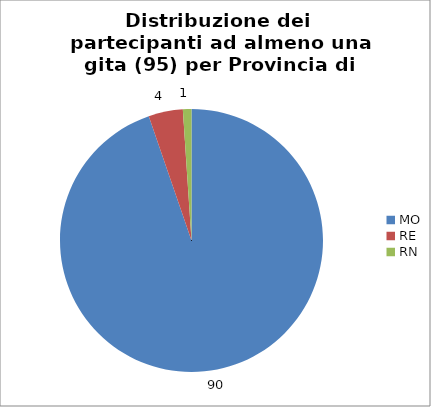
| Category | Nr. Tesserati |
|---|---|
| MO | 90 |
| RE | 4 |
| RN | 1 |